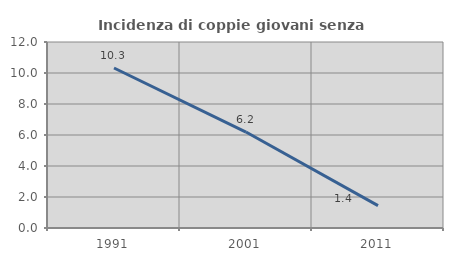
| Category | Incidenza di coppie giovani senza figli |
|---|---|
| 1991.0 | 10.323 |
| 2001.0 | 6.19 |
| 2011.0 | 1.442 |